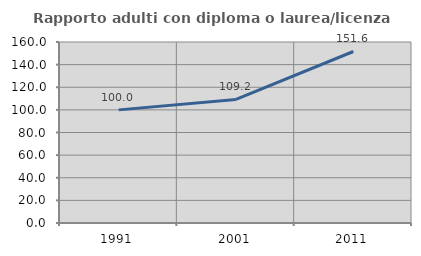
| Category | Rapporto adulti con diploma o laurea/licenza media  |
|---|---|
| 1991.0 | 100 |
| 2001.0 | 109.211 |
| 2011.0 | 151.613 |